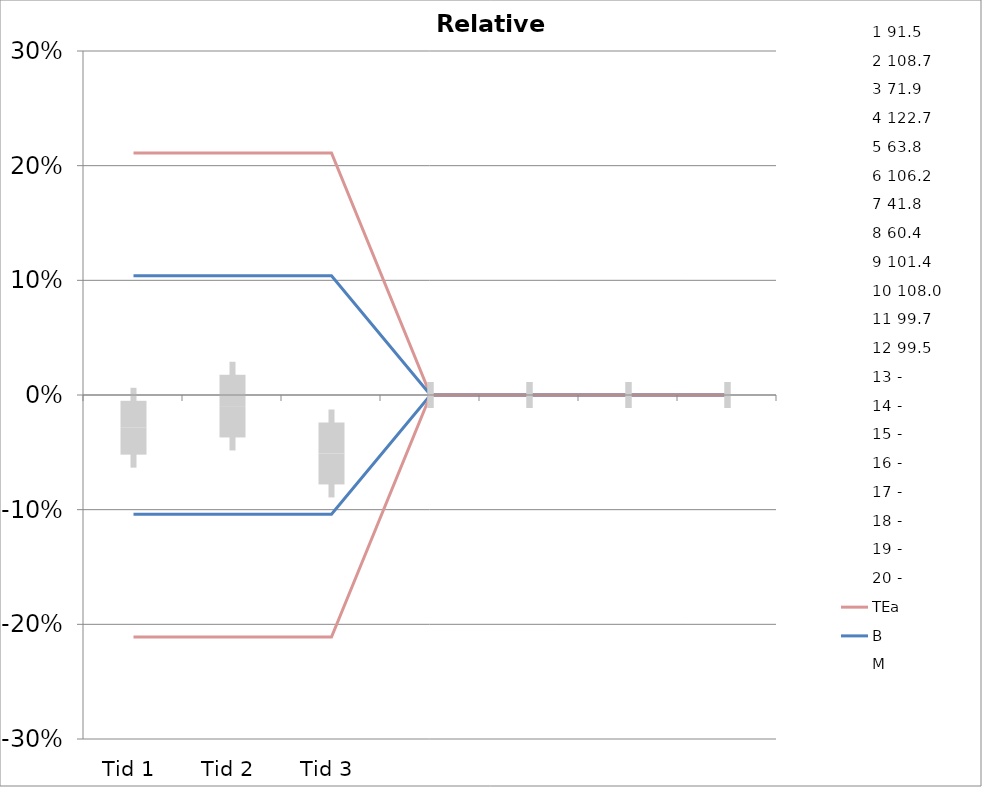
| Category | 1 | 2 | 3 | 4 | 5 | 6 | 7 | 8 | 9 | 10 | 11 | 12 | 13 | 14 | 15 | 16 | 17 | 18 | 19 | 20 | TEa | B | -B | -TEa | M |
|---|---|---|---|---|---|---|---|---|---|---|---|---|---|---|---|---|---|---|---|---|---|---|---|---|---|
| Tid 1 | -0.059 | -0.051 | -0.104 | -0.026 | -0.008 | 0 | -0.072 | 0.018 | -0.017 | -0.034 | 0.013 | -0.003 | 0 | 0 | 0 | 0 | 0 | 0 | 0 | 0 | 0.211 | 0.104 | -0.104 | -0.211 | -0.029 |
| Tid 2 | -0.067 | 0.012 | -0.011 | 0.029 | 0.099 | -0.03 | -0.007 | -0.041 | -0.038 | -0.044 | -0.006 | -0.011 | 0 | 0 | 0 | 0 | 0 | 0 | 0 | 0 | 0.211 | 0.104 | -0.104 | -0.211 | -0.01 |
| Tid 3 | -0.07 | -0.08 | -0.127 | -0.032 | -0.002 | 0.005 | -0.103 | -0.05 | -0.09 | -0.023 | -0.01 | -0.031 | 0 | 0 | 0 | 0 | 0 | 0 | 0 | 0 | 0.211 | 0.104 | -0.104 | -0.211 | -0.051 |